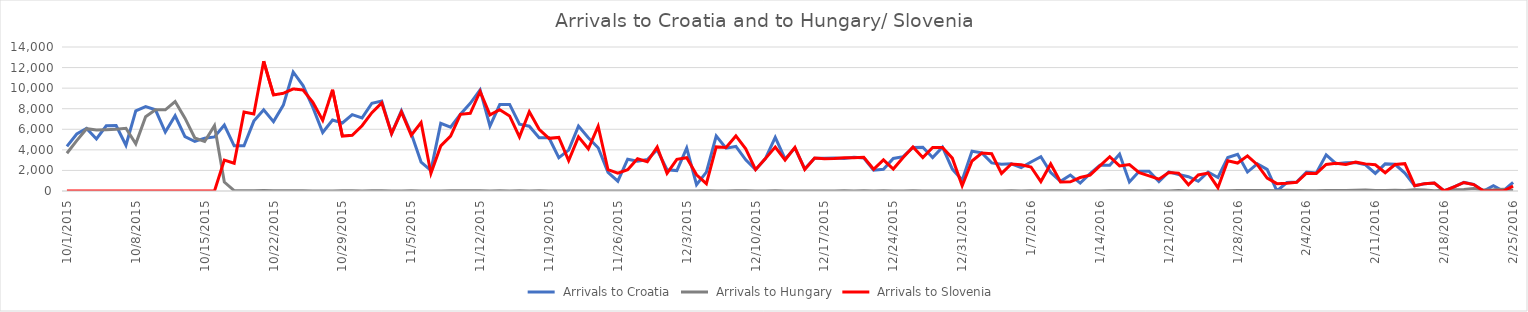
| Category | Series 0 | Series 1 | Series 2 |
|---|---|---|---|
| 10/1/15 | 4344 | 3667 | 0 |
| 10/2/15 | 5546 | 4897 | 0 |
| 10/3/15 | 6086 | 6056 | 0 |
| 10/4/15 | 5065 | 5925 | 0 |
| 10/5/15 | 6338 | 5952 | 0 |
| 10/6/15 | 6370 | 6000 | 0 |
| 10/7/15 | 4446 | 6103 | 0 |
| 10/8/15 | 7798 | 4583 | 6 |
| 10/9/15 | 8201 | 7215 | 0 |
| 10/10/15 | 7896 | 7907 | 0 |
| 10/11/15 | 5732 | 7897 | 0 |
| 10/12/15 | 7317 | 8702 | 0 |
| 10/13/15 | 5286 | 7081 | 0 |
| 10/14/15 | 4814 | 5157 | 0 |
| 10/15/15 | 5138 | 4808 | 0 |
| 10/16/15 | 5260 | 6353 | 0 |
| 10/17/15 | 6415 | 870 | 3000 |
| 10/18/15 | 4390 | 41 | 2700 |
| 10/19/15 | 4388 | 22 | 7677 |
| 10/20/15 | 6793 | 36 | 7478 |
| 10/21/15 | 7900 | 39 | 12616 |
| 10/22/15 | 6748 | 32 | 9339 |
| 10/23/15 | 8348 | 29 | 9500 |
| 10/24/15 | 11570 | 35 | 9925 |
| 10/25/15 | 10249 | 34 | 9818 |
| 10/26/15 | 8128 | 12 | 8625 |
| 10/27/15 | 5683 | 7 | 6877 |
| 10/28/15 | 6900 | 4 | 9848 |
| 10/29/15 | 6615 | 23 | 5341 |
| 10/30/15 | 7429 | 18 | 5409 |
| 10/31/15 | 7110 | 10 | 6344 |
| 11/1/15 | 8534 | 14 | 7611 |
| 11/2/15 | 8746 | 31 | 8568 |
| 11/3/15 | 5573 | 8 | 5591 |
| 11/4/15 | 7792 | 10 | 7693 |
| 11/5/15 | 5587 | 18 | 5426 |
| 11/6/15 | 2809 | 4 | 6655 |
| 11/7/15 | 2000 | 8 | 1716 |
| 11/8/15 | 6579 | 9 | 4381 |
| 11/9/15 | 6214 | 25 | 5341 |
| 11/10/15 | 7474 | 14 | 7457 |
| 11/11/15 | 8524 | 13 | 7554 |
| 11/12/15 | 9823 | 23 | 9681 |
| 11/13/15 | 6314 | 6 | 7397 |
| 11/14/15 | 8405 | 21 | 7905 |
| 11/15/15 | 8415 | 8 | 7300 |
| 11/16/15 | 6490 | 15 | 5261 |
| 11/17/15 | 6304 | 5 | 7704 |
| 11/18/15 | 5180 | 15 | 5998 |
| 11/19/15 | 5167 | 4 | 5119 |
| 11/20/15 | 3230 | 9 | 5211 |
| 11/21/15 | 3977 | 2 | 2952 |
| 11/22/15 | 6305 | 11 | 5260 |
| 11/23/15 | 5184 | 4 | 4102 |
| 11/24/15 | 4203 | 4 | 6297 |
| 11/25/15 | 1808 | 6 | 2070 |
| 11/26/15 | 952 | 10 | 1742 |
| 11/27/15 | 3095 | 2 | 2065 |
| 11/28/15 | 2886 | 6 | 3139 |
| 11/29/15 | 3060 | 3 | 2843 |
| 11/30/15 | 4009 | 7 | 4274 |
| 12/1/15 | 2066 | 4 | 1709 |
| 12/2/15 | 1982 | 4 | 3077 |
| 12/3/15 | 4174 | 9 | 3237 |
| 12/4/15 | 611 | 1 | 1577 |
| 12/5/15 | 1835 | 31 | 715 |
| 12/6/15 | 5339 | 7 | 4288 |
| 12/7/15 | 4162 | 0 | 4240 |
| 12/8/15 | 4335 | 13 | 5351 |
| 12/9/15 | 3027 | 14 | 4103 |
| 12/10/15 | 2076 | 3 | 2078 |
| 12/11/15 | 3149 | 0 | 3149 |
| 12/12/15 | 5225 | 13 | 4271 |
| 12/13/15 | 3112 | 10 | 3016 |
| 12/14/15 | 4174 | 3 | 4250 |
| 12/15/15 | 2160 | 2 | 2098 |
| 12/16/15 | 3177 | 6 | 3214 |
| 12/17/15 | 3192 | 0 | 3135 |
| 12/18/15 | 3200 | 11 | 3150 |
| 12/19/15 | 3156 | 31 | 3222 |
| 12/20/15 | 3276 | 8 | 3233 |
| 12/21/15 | 3210 | 25 | 3278 |
| 12/22/15 | 2027 | 1 | 2118 |
| 12/23/15 | 2116 | 21 | 3030 |
| 12/24/15 | 3166 | 8 | 2131 |
| 12/25/15 | 3339 | 2 | 3257 |
| 12/26/15 | 4241 | 17 | 4274 |
| 12/27/15 | 4251 | 10 | 3253 |
| 12/28/15 | 3249 | 0 | 4228 |
| 12/29/15 | 4253 | 0 | 4239 |
| 12/30/15 | 2132 | 11 | 3195 |
| 12/31/15 | 1058 | 5 | 511 |
| 1/1/16 | 3869 | 0 | 2914 |
| 1/2/16 | 3710 | 0 | 3690 |
| 1/3/16 | 2732 | 0 | 3619 |
| 1/4/16 | 2591 | 0 | 1708 |
| 1/5/16 | 2650 | 18 | 2626 |
| 1/6/16 | 2273 | 5 | 2550 |
| 1/7/16 | 2814 | 31 | 2337 |
| 1/8/16 | 3332 | 0 | 916 |
| 1/9/16 | 1799 | 15 | 2630 |
| 1/10/16 | 942 | 28 | 880 |
| 1/11/16 | 1549 | 7 | 897 |
| 1/12/16 | 769 | 2 | 1308 |
| 1/13/16 | 1679 | 0 | 1544 |
| 1/14/16 | 2502 | 4 | 2449 |
| 1/15/16 | 2493 | 30 | 3330 |
| 1/16/16 | 3579 | 30 | 2435 |
| 1/17/16 | 878 | 30 | 2570 |
| 1/18/16 | 1930 | 9 | 1783 |
| 1/19/16 | 1917 | 29 | 1476 |
| 1/20/16 | 914 | 0 | 1154 |
| 1/21/16 | 1865 | 10 | 1787 |
| 1/22/16 | 1599 | 47 | 1738 |
| 1/23/16 | 1394 | 10 | 606 |
| 1/24/16 | 946 | 15 | 1564 |
| 1/25/16 | 1847 | 5 | 1746 |
| 1/26/16 | 1309 | 4 | 326 |
| 1/27/16 | 3256 | 36 | 2935 |
| 1/28/16 | 3565 | 51 | 2719 |
| 1/29/16 | 1843 | 38 | 3416 |
| 1/30/16 | 2641 | 38 | 2556 |
| 1/31/16 | 2098 | 38 | 1249 |
| 2/1/16 | 0 | 31 | 716 |
| 2/2/16 | 822 | 69 | 765 |
| 2/3/16 | 881 | 46 | 841 |
| 2/4/16 | 1836 | 31 | 1733 |
| 2/5/16 | 1750 | 19 | 1713 |
| 2/6/16 | 3510 | 49 | 2580 |
| 2/7/16 | 2658 | 53 | 2694 |
| 2/8/16 | 2736 | 48 | 2582 |
| 2/9/16 | 2764 | 72 | 2805 |
| 2/10/16 | 2544 | 104 | 2637 |
| 2/11/16 | 1716 | 54 | 2547 |
| 2/12/16 | 2635 | 39 | 1774 |
| 2/13/16 | 2595 | 66 | 2576 |
| 2/14/16 | 1749 | 51 | 2660 |
| 2/15/16 | 512 | 119 | 516 |
| 2/16/16 | 701 | 93 | 715 |
| 2/17/16 | 769 | 34 | 769 |
| 2/18/16 | 0 | 73 | 0 |
| 2/19/16 | 408 | 113 | 408 |
| 2/20/16 | 834 | 151 | 828 |
| 2/21/16 | 630 | 237 | 623 |
| 2/22/16 | 0 | 103 | 0 |
| 2/23/16 | 507 | 112 | 0 |
| 2/24/16 | 0 | 166 | 0 |
| 2/25/16 | 841 | 76 | 478 |